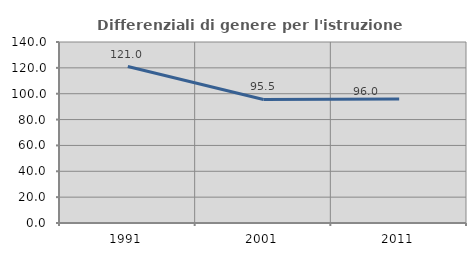
| Category | Differenziali di genere per l'istruzione superiore |
|---|---|
| 1991.0 | 120.992 |
| 2001.0 | 95.541 |
| 2011.0 | 95.956 |